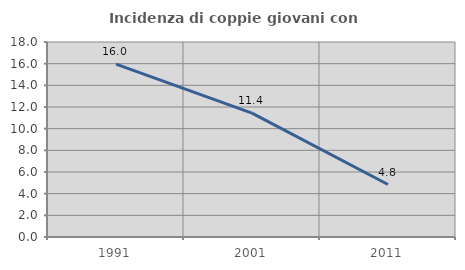
| Category | Incidenza di coppie giovani con figli |
|---|---|
| 1991.0 | 15.952 |
| 2001.0 | 11.433 |
| 2011.0 | 4.844 |